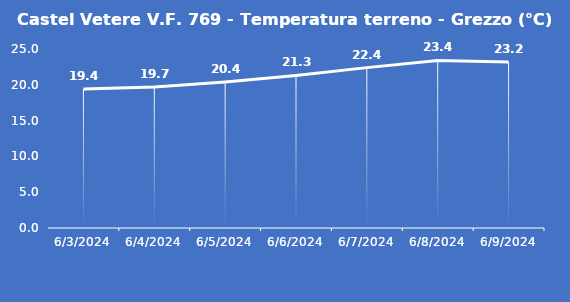
| Category | Castel Vetere V.F. 769 - Temperatura terreno - Grezzo (°C) |
|---|---|
| 6/3/24 | 19.4 |
| 6/4/24 | 19.7 |
| 6/5/24 | 20.4 |
| 6/6/24 | 21.3 |
| 6/7/24 | 22.4 |
| 6/8/24 | 23.4 |
| 6/9/24 | 23.2 |